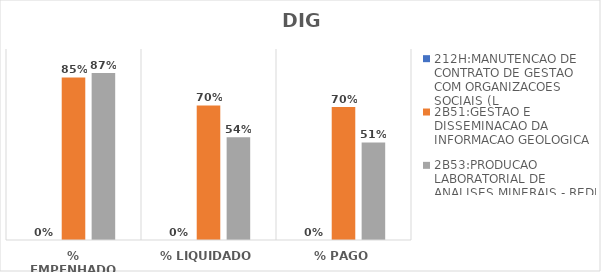
| Category | 212H:MANUTENCAO DE CONTRATO DE GESTAO COM ORGANIZACOES SOCIAIS (L | 2B51:GESTAO E DISSEMINACAO DA INFORMACAO GEOLOGICA | 2B53:PRODUCAO LABORATORIAL DE ANALISES MINERAIS - REDE LAMIN |
|---|---|---|---|
| % EMPENHADO | 0 | 0.851 | 0.875 |
| % LIQUIDADO | 0 | 0.705 | 0.538 |
| % PAGO | 0 | 0.696 | 0.511 |